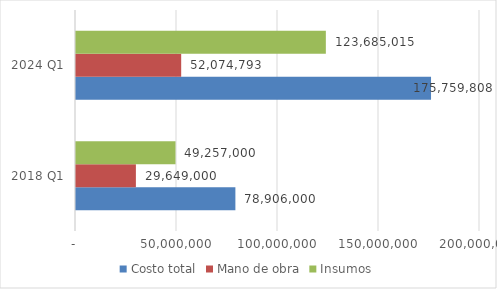
| Category | Costo total | Mano de obra | Insumos |
|---|---|---|---|
| 2018 Q1 | 78906000 | 29649000 | 49257000 |
| 2024 Q1 | 175759808.05 | 52074793 | 123685015.05 |